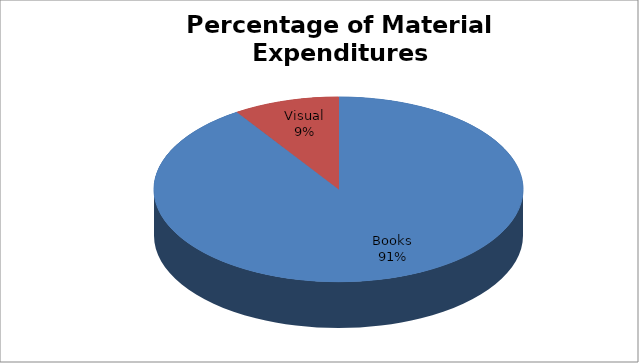
| Category | Series 0 |
|---|---|
| Books | 9368.53 |
| Visual | 958.19 |